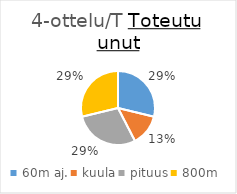
| Category | Series 0 |
|---|---|
| 60m aj. | 1000 |
| kuula | 474 |
| pituus | 1000 |
| 800m | 1000 |